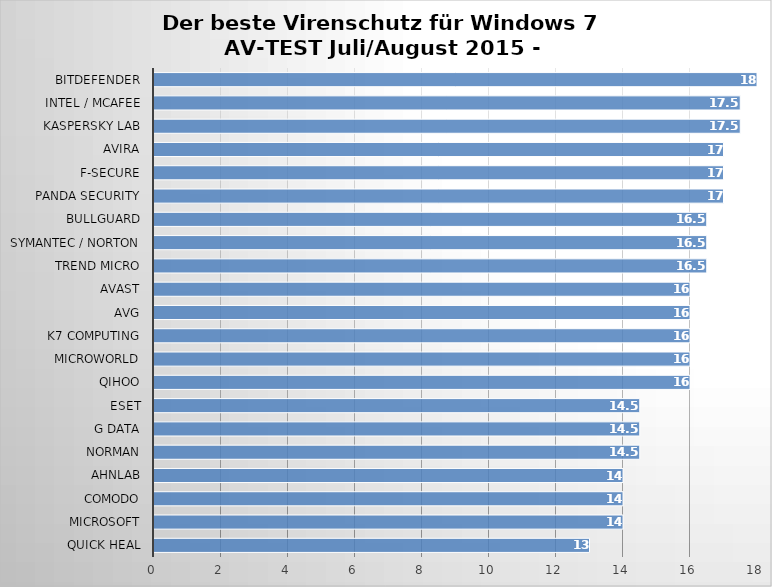
| Category | Series 0 |
|---|---|
| Quick Heal | 13 |
| Microsoft | 14 |
| Comodo | 14 |
| AhnLab | 14 |
| Norman | 14.5 |
| G Data | 14.5 |
| ESET | 14.5 |
| Qihoo | 16 |
| Microworld | 16 |
| K7 Computing | 16 |
| AVG | 16 |
| Avast | 16 |
| Trend Micro | 16.5 |
| Symantec / Norton | 16.5 |
| BullGuard | 16.5 |
| Panda Security | 17 |
| F-Secure | 17 |
| Avira | 17 |
| Kaspersky Lab | 17.5 |
| Intel / McAfee | 17.5 |
| Bitdefender | 18 |